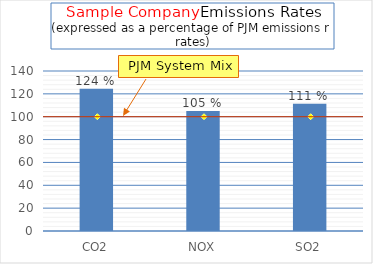
| Category | % of PJM Emissions |
|---|---|
| CO2 | 124.433 |
| NOX | 105.07 |
| SO2 | 111.259 |